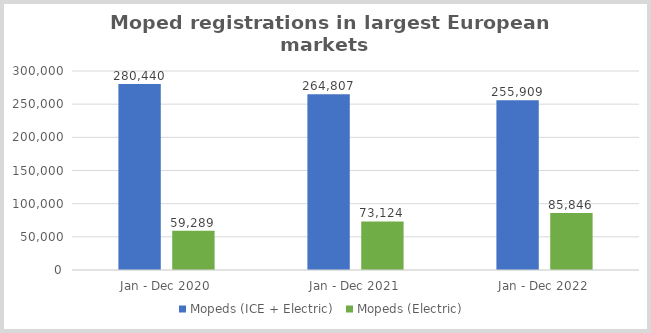
| Category | Mopeds (ICE + Electric)  | Mopeds (Electric)  |
|---|---|---|
| Jan - Dec 2020 | 280440 | 59289 |
| Jan - Dec 2021 | 264807 | 73124 |
| Jan - Dec 2022 | 255909 | 85846 |